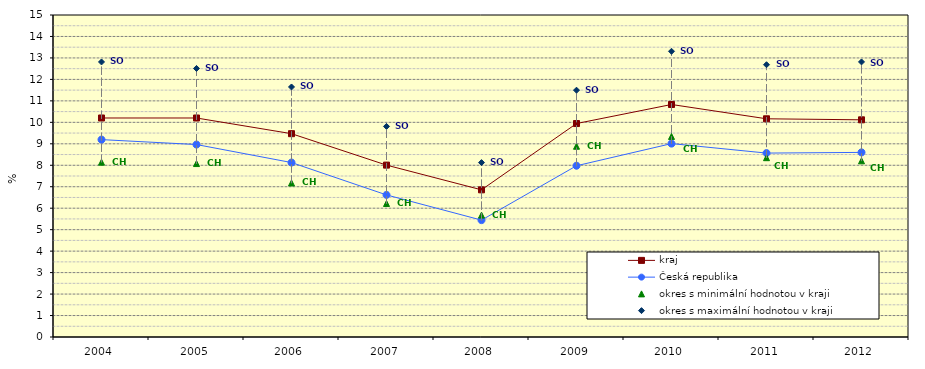
| Category | kraj | Česká republika | okres s minimální hodnotou v kraji | okres s maximální hodnotou v kraji |
|---|---|---|---|---|
| 2004.0 | 10.202 | 9.195 | 8.144 | 12.813 |
| 2005.0 | 10.202 | 8.965 | 8.08 | 12.51 |
| 2006.0 | 9.472 | 8.126 | 7.176 | 11.647 |
| 2007.0 | 8.007 | 6.619 | 6.22 | 9.81 |
| 2008.0 | 6.855 | 5.444 | 5.678 | 8.125 |
| 2009.0 | 9.944 | 7.977 | 8.886 | 11.497 |
| 2010.0 | 10.831 | 9.009 | 9.344 | 13.31 |
| 2011.0 | 10.165 | 8.568 | 8.354 | 12.682 |
| 2012.0 | 10.117 | 8.6 | 8.208 | 12.815 |